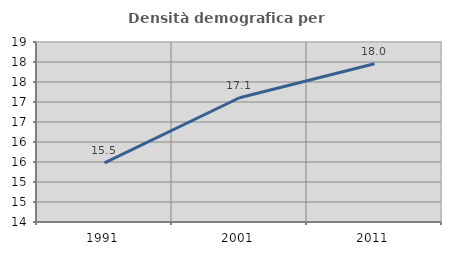
| Category | Densità demografica |
|---|---|
| 1991.0 | 15.478 |
| 2001.0 | 17.106 |
| 2011.0 | 17.956 |